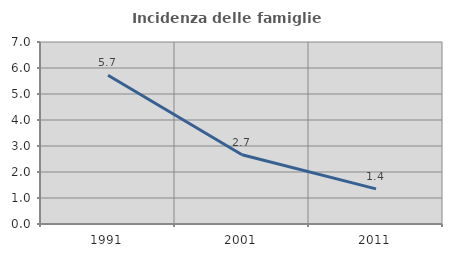
| Category | Incidenza delle famiglie numerose |
|---|---|
| 1991.0 | 5.722 |
| 2001.0 | 2.662 |
| 2011.0 | 1.351 |